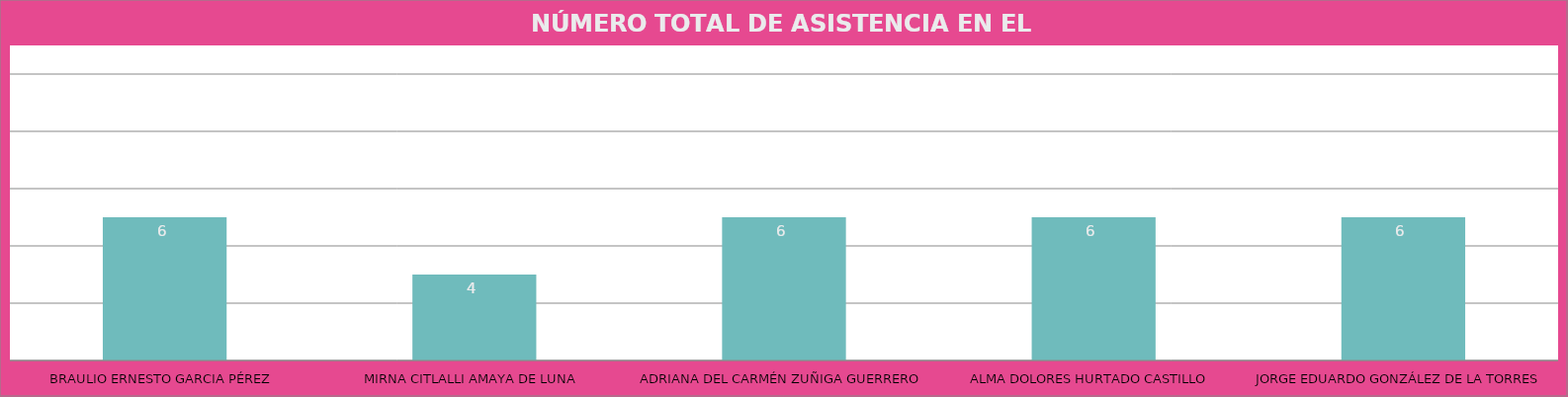
| Category | BRAULIO ERNESTO GARCIA PÉREZ |
|---|---|
| BRAULIO ERNESTO GARCIA PÉREZ | 6 |
| MIRNA CITLALLI AMAYA DE LUNA | 4 |
| ADRIANA DEL CARMÉN ZUÑIGA GUERRERO | 6 |
| ALMA DOLORES HURTADO CASTILLO | 6 |
| JORGE EDUARDO GONZÁLEZ DE LA TORRES | 6 |